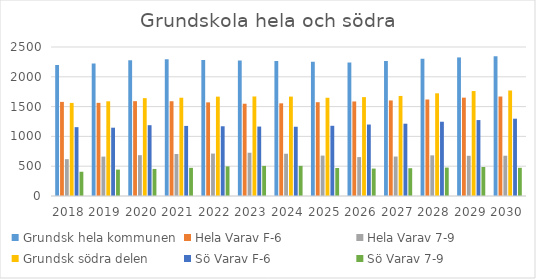
| Category | Grundsk hela kommunen | Hela Varav F-6 | Hela Varav 7-9 | Grundsk södra delen  | Sö Varav F-6 | Sö Varav 7-9 |
|---|---|---|---|---|---|---|
| 2018.0 | 2197 | 1579 | 618 | 1562 | 1155 | 407 |
| 2019.0 | 2224 | 1563 | 661 | 1589 | 1146 | 443 |
| 2020.0 | 2276 | 1591 | 685 | 1642 | 1188 | 454 |
| 2021.0 | 2295 | 1590 | 705 | 1649 | 1176 | 473 |
| 2022.0 | 2283 | 1571 | 712 | 1667 | 1170 | 497 |
| 2023.0 | 2274 | 1548 | 726 | 1670 | 1165 | 505 |
| 2024.0 | 2264 | 1555 | 709 | 1668 | 1162 | 506 |
| 2025.0 | 2252 | 1574 | 678 | 1648 | 1178 | 470 |
| 2026.0 | 2239 | 1586 | 653 | 1659 | 1199 | 460 |
| 2027.0 | 2265 | 1603 | 662 | 1679 | 1213 | 466 |
| 2028.0 | 2301 | 1619 | 682 | 1723 | 1246 | 477 |
| 2029.0 | 2325 | 1650 | 675 | 1761 | 1274 | 487 |
| 2030.0 | 2345 | 1669 | 676 | 1770 | 1297 | 473 |